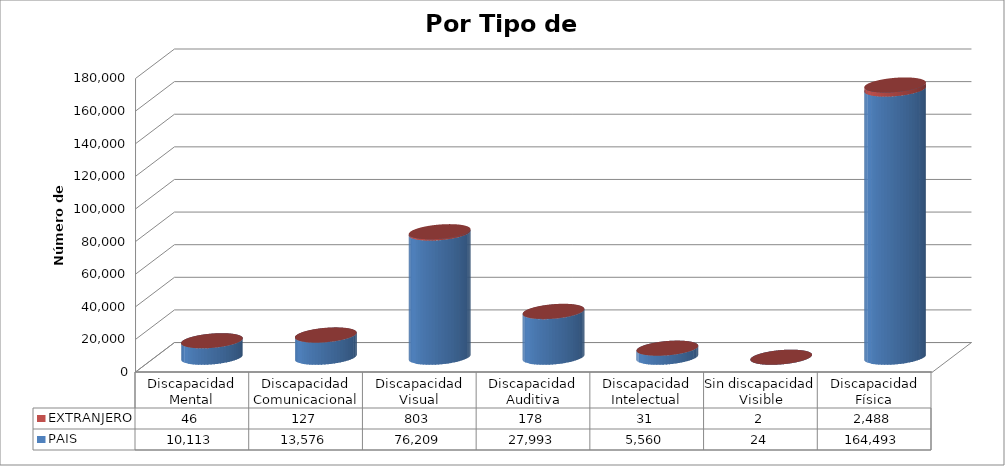
| Category | PAIS | EXTRANJERO |
|---|---|---|
| Discapacidad Mental | 10113 | 46 |
| Discapacidad Comunicacional | 13576 | 127 |
| Discapacidad Visual | 76209 | 803 |
| Discapacidad Auditiva | 27993 | 178 |
| Discapacidad Intelectual | 5560 | 31 |
| Sin discapacidad Visible | 24 | 2 |
| Discapacidad Física | 164493 | 2488 |